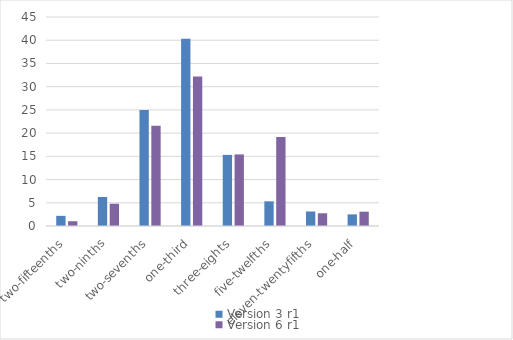
| Category | Version 3 r1 | Version 6 r1 |
|---|---|---|
| two-fifteenths | 2.188 | 1.027 |
| two-ninths | 6.25 | 4.795 |
| two-sevenths | 25 | 21.575 |
| one-third | 40.312 | 32.192 |
| three-eights | 15.312 | 15.411 |
| five-twelfths | 5.312 | 19.178 |
| eleven-twentyfifths | 3.125 | 2.74 |
| one-half | 2.5 | 3.082 |